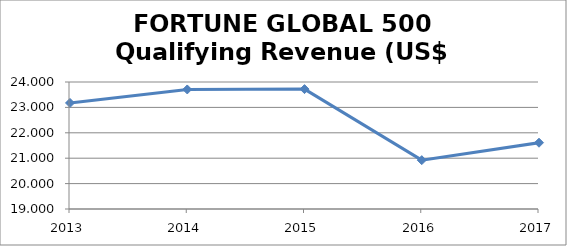
| Category | Qualifying Revenue (US$ Billions) |
|---|---|
| 2013.0 | 23.175 |
| 2014.0 | 23.706 |
| 2015.0 | 23.72 |
| 2016.0 | 20.923 |
| 2017.0 | 21.609 |